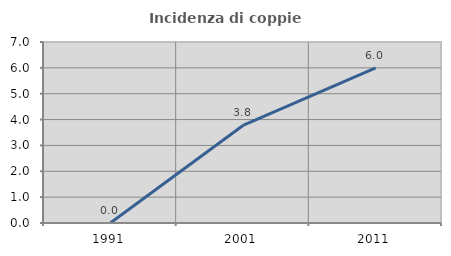
| Category | Incidenza di coppie miste |
|---|---|
| 1991.0 | 0 |
| 2001.0 | 3.774 |
| 2011.0 | 6 |